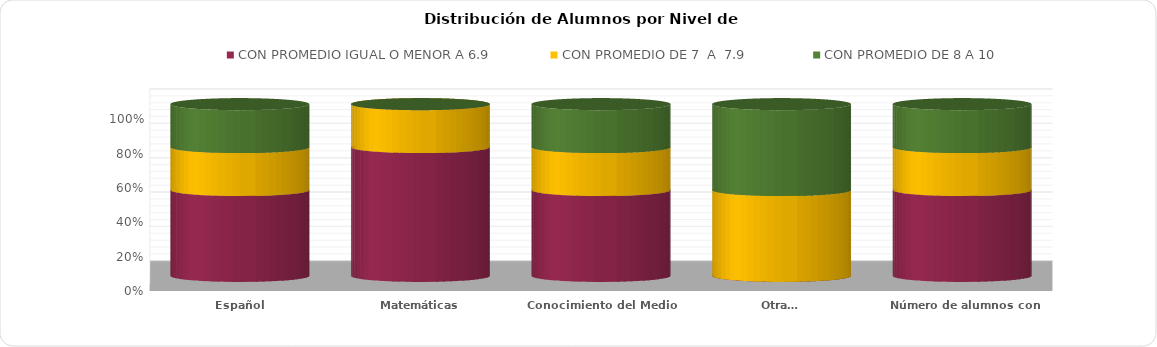
| Category | CON PROMEDIO IGUAL O MENOR A 6.9 | CON PROMEDIO DE 7  A  7.9   | CON PROMEDIO DE 8 A 10 |
|---|---|---|---|
| Español | 2 | 1 | 1 |
| Matemáticas | 3 | 1 | 0 |
| Conocimiento del Medio | 2 | 1 | 1 |
| Otra… | 0 | 2 | 2 |
| Número de alumnos con Promedio | 2 | 1 | 1 |